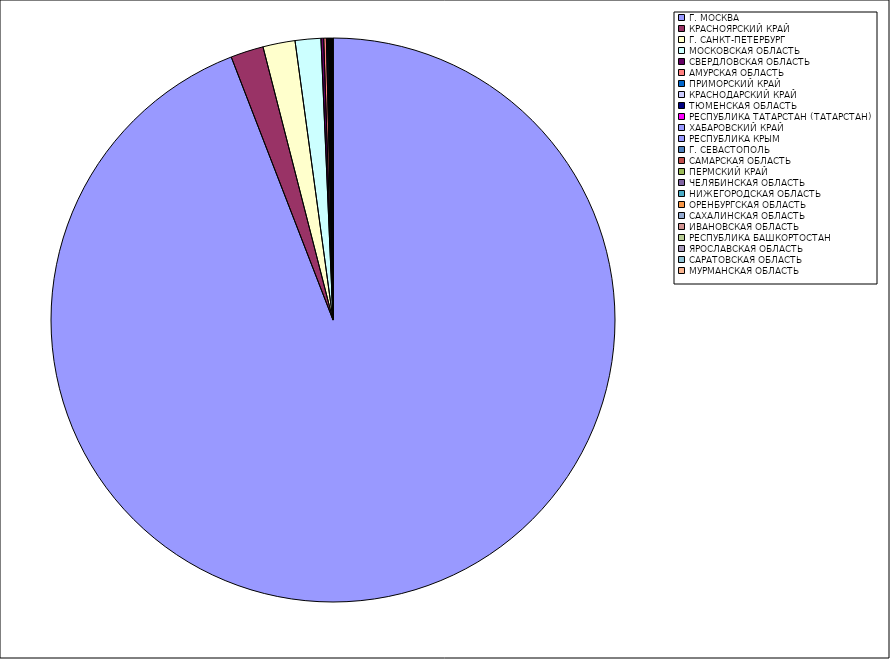
| Category | Оборот |
|---|---|
| Г. МОСКВА | 94.054 |
| КРАСНОЯРСКИЙ КРАЙ | 1.882 |
| Г. САНКТ-ПЕТЕРБУРГ | 1.839 |
| МОСКОВСКАЯ ОБЛАСТЬ | 1.47 |
| СВЕРДЛОВСКАЯ ОБЛАСТЬ | 0.155 |
| АМУРСКАЯ ОБЛАСТЬ | 0.151 |
| ПРИМОРСКИЙ КРАЙ | 0.06 |
| КРАСНОДАРСКИЙ КРАЙ | 0.056 |
| ТЮМЕНСКАЯ ОБЛАСТЬ | 0.039 |
| РЕСПУБЛИКА ТАТАРСТАН (ТАТАРСТАН) | 0.035 |
| ХАБАРОВСКИЙ КРАЙ | 0.035 |
| РЕСПУБЛИКА КРЫМ | 0.022 |
| Г. СЕВАСТОПОЛЬ | 0.018 |
| САМАРСКАЯ ОБЛАСТЬ | 0.015 |
| ПЕРМСКИЙ КРАЙ | 0.015 |
| ЧЕЛЯБИНСКАЯ ОБЛАСТЬ | 0.014 |
| НИЖЕГОРОДСКАЯ ОБЛАСТЬ | 0.012 |
| ОРЕНБУРГСКАЯ ОБЛАСТЬ | 0.011 |
| САХАЛИНСКАЯ ОБЛАСТЬ | 0.008 |
| ИВАНОВСКАЯ ОБЛАСТЬ | 0.008 |
| РЕСПУБЛИКА БАШКОРТОСТАН | 0.008 |
| ЯРОСЛАВСКАЯ ОБЛАСТЬ | 0.007 |
| САРАТОВСКАЯ ОБЛАСТЬ | 0.007 |
| МУРМАНСКАЯ ОБЛАСТЬ | 0.007 |